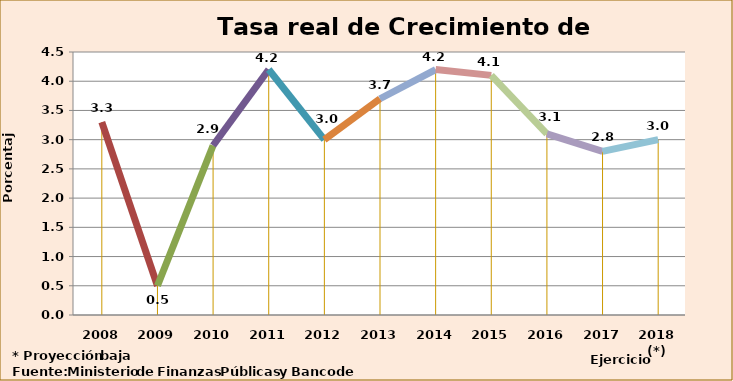
| Category | Series 0 |
|---|---|
| 2008 | 3.3 |
| 2009 | 0.5 |
| 2010 | 2.9 |
| 2011 | 4.2 |
| 2012 | 3 |
| 2013 | 3.7 |
| 2014 | 4.2 |
| 2015 | 4.1 |
| 2016 | 3.1 |
| 2017 | 2.8 |
| 2018 (*) | 3 |